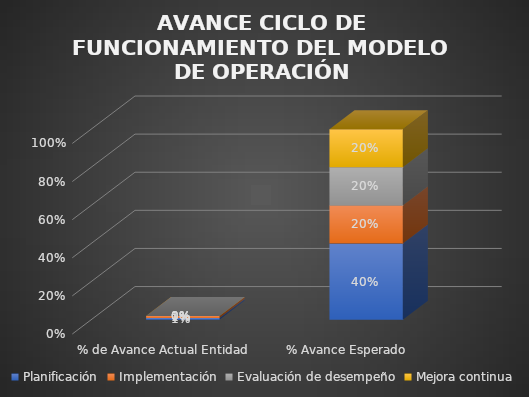
| Category | Planificación | Implementación | Evaluación de desempeño | Mejora continua |
|---|---|---|---|---|
| % de Avance Actual Entidad | 0.009 | 0.011 | 0 | 0 |
| % Avance Esperado | 0.4 | 0.2 | 0.2 | 0.2 |